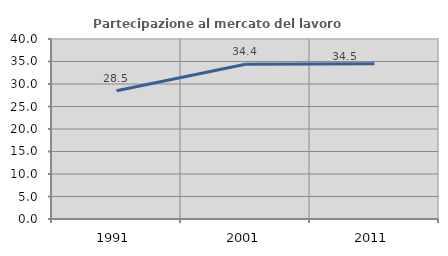
| Category | Partecipazione al mercato del lavoro  femminile |
|---|---|
| 1991.0 | 28.494 |
| 2001.0 | 34.384 |
| 2011.0 | 34.508 |